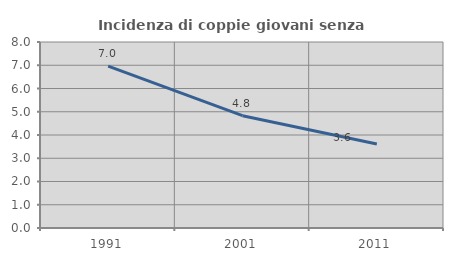
| Category | Incidenza di coppie giovani senza figli |
|---|---|
| 1991.0 | 6.963 |
| 2001.0 | 4.83 |
| 2011.0 | 3.612 |